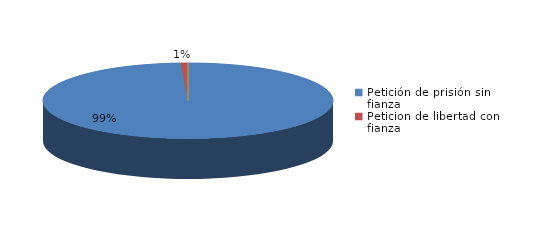
| Category | Series 0 |
|---|---|
| Petición de prisión sin fianza | 124 |
| Peticion de libertad con fianza | 1 |
| Petición de libertad | 0 |